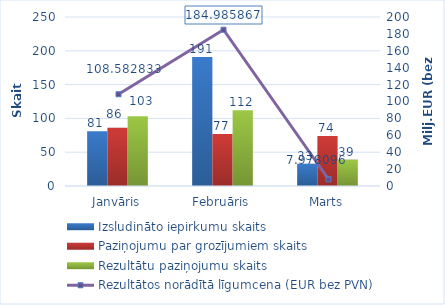
| Category | Izsludināto iepirkumu skaits | Paziņojumu par grozījumiem skaits | Rezultātu paziņojumu skaits |
|---|---|---|---|
| Janvāris | 81 | 86 | 103 |
| Februāris | 191 | 77 | 112 |
| Marts | 33 | 74 | 39 |